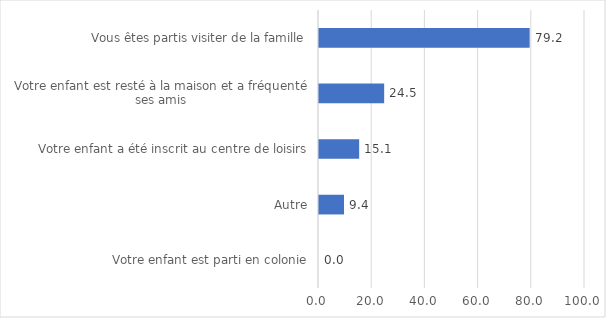
| Category | Series 0 |
|---|---|
| Votre enfant est parti en colonie | 0 |
| Autre | 9.4 |
| Votre enfant a été inscrit au centre de loisirs | 15.1 |
| Votre enfant est resté à la maison et a fréquenté ses amis | 24.5 |
| Vous êtes partis visiter de la famille | 79.2 |